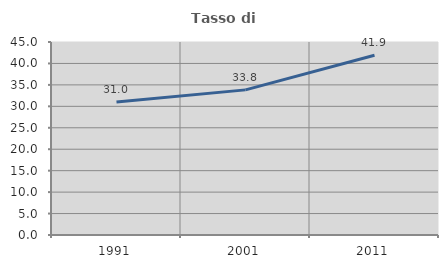
| Category | Tasso di occupazione   |
|---|---|
| 1991.0 | 30.995 |
| 2001.0 | 33.836 |
| 2011.0 | 41.905 |